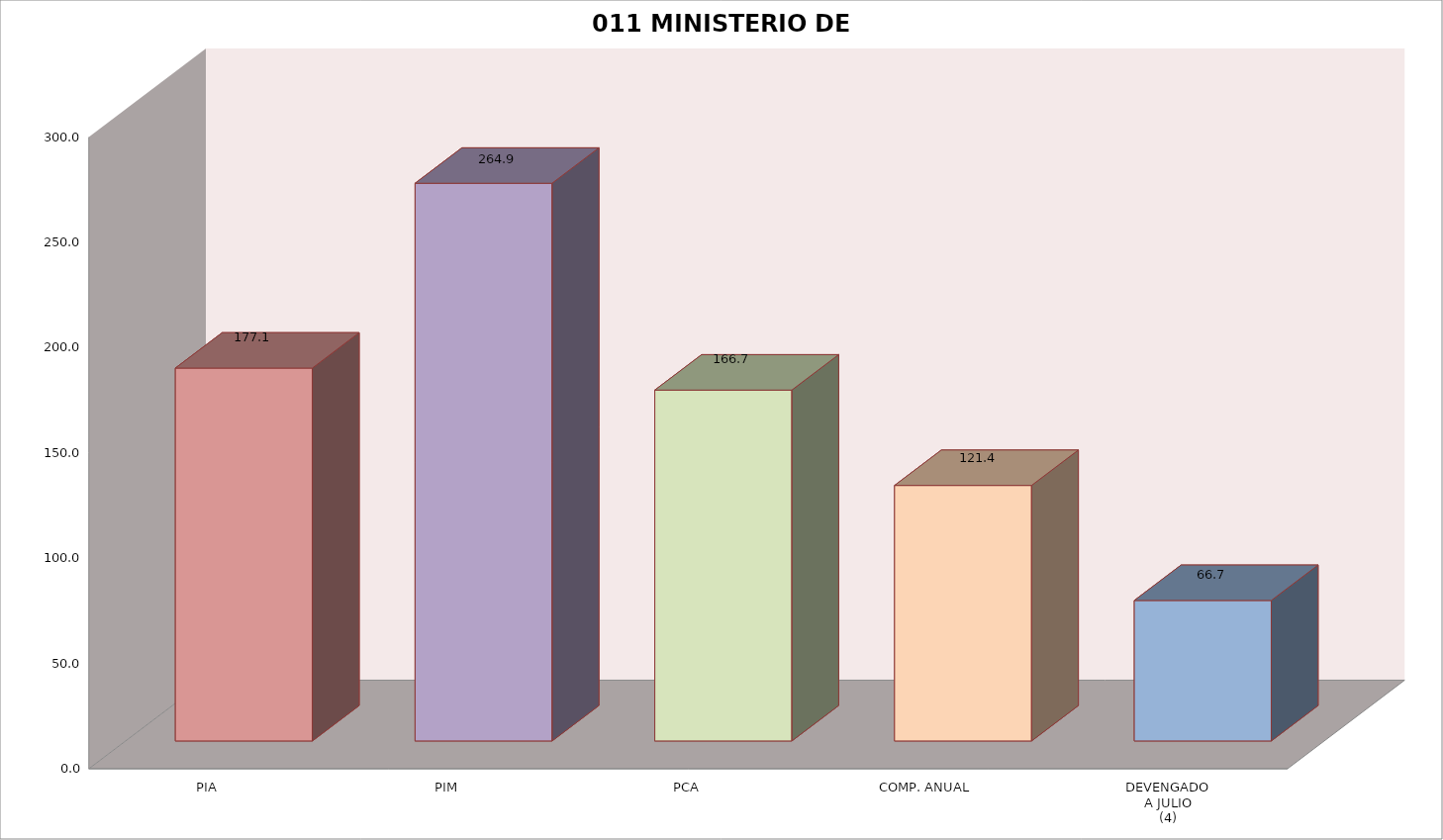
| Category | 011 MINISTERIO DE SALUD |
|---|---|
| PIA | 177.09 |
| PIM | 264.874 |
| PCA | 166.65 |
| COMP. ANUAL | 121.355 |
| DEVENGADO
A JULIO
(4) | 66.731 |